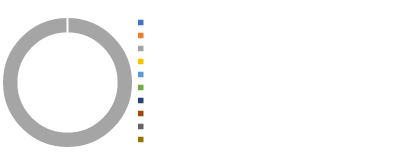
| Category | Income |
|---|---|
|                                                                                                 | 0 |
|                                                                                                 | 0 |
|                                                                                                 | 1 |
|                                                                                                 | 0 |
|                                                                                                 | 0 |
|                                                                                                 | 0 |
|                                                                                                 | 0 |
|                                                                                                 | 0 |
|                                                                                                 | 0 |
|                                                                                                 | 0 |